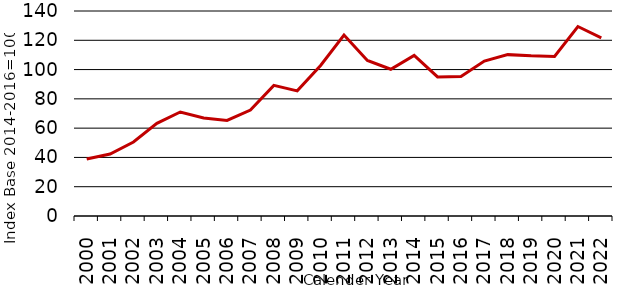
| Category | Series 14 |
|---|---|
| 2000.0 | 38.942 |
| 2001.0 | 42.297 |
| 2002.0 | 50.55 |
| 2003.0 | 63.299 |
| 2004.0 | 71.019 |
| 2005.0 | 66.909 |
| 2006.0 | 65.24 |
| 2007.0 | 72.335 |
| 2008.0 | 89.214 |
| 2009.0 | 85.478 |
| 2010.0 | 102.814 |
| 2011.0 | 123.593 |
| 2012.0 | 106.231 |
| 2013.0 | 100.213 |
| 2014.0 | 109.708 |
| 2015.0 | 94.984 |
| 2016.0 | 95.309 |
| 2017.0 | 105.831 |
| 2018.0 | 110.202 |
| 2019.0 | 109.376 |
| 2020.0 | 108.998 |
| 2021.0 | 129.404 |
| 2022.0 | 121.666 |